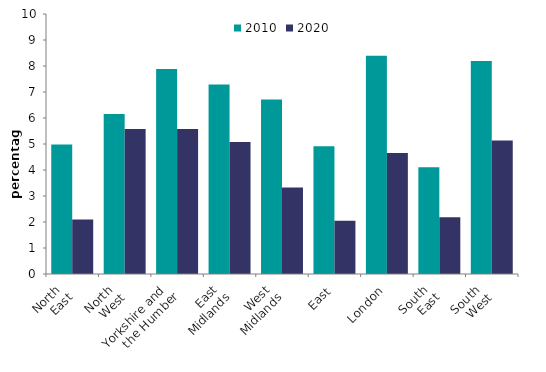
| Category | 2010 | 2020 |
|---|---|---|
| North 
East | 4.979 | 2.093 |
| North 
West | 6.152 | 5.581 |
| Yorkshire and 
the Humber | 7.886 | 5.575 |
| East 
Midlands | 7.287 | 5.081 |
| West 
Midlands | 6.711 | 3.331 |
| East | 4.914 | 2.052 |
| London | 8.392 | 4.654 |
| South 
East | 4.106 | 2.181 |
| South 
West | 8.189 | 5.134 |